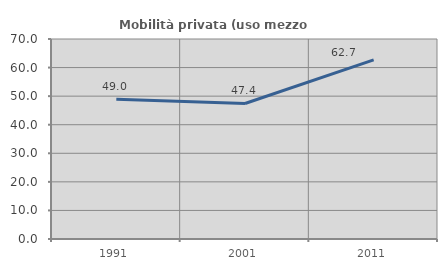
| Category | Mobilità privata (uso mezzo privato) |
|---|---|
| 1991.0 | 48.955 |
| 2001.0 | 47.439 |
| 2011.0 | 62.705 |